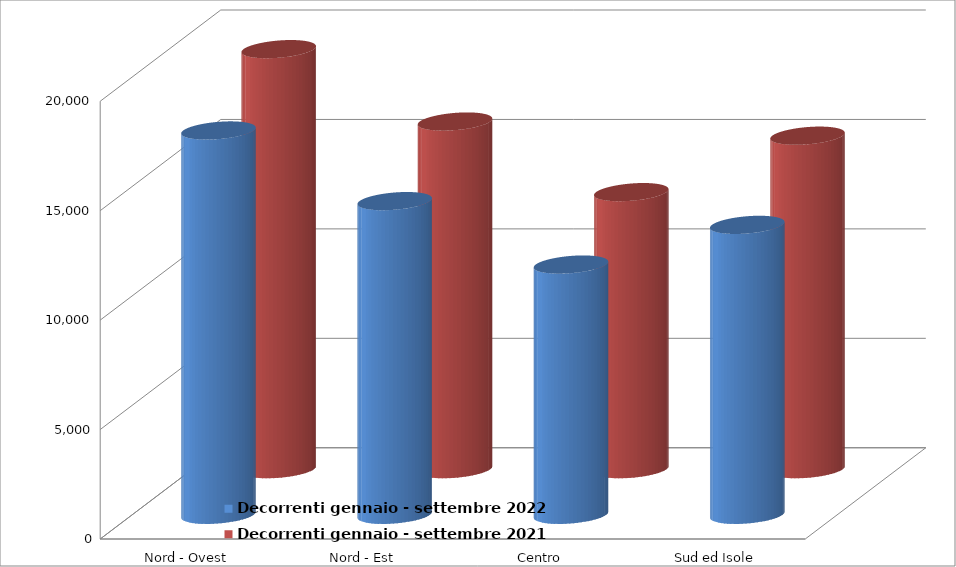
| Category | Decorrenti gennaio - settembre 2022 | Decorrenti gennaio - settembre 2021 |
|---|---|---|
| Nord - Ovest | 17559 | 19191 |
| Nord - Est | 14332 | 15884 |
| Centro | 11434 | 12658 |
| Sud ed Isole | 13247 | 15237 |